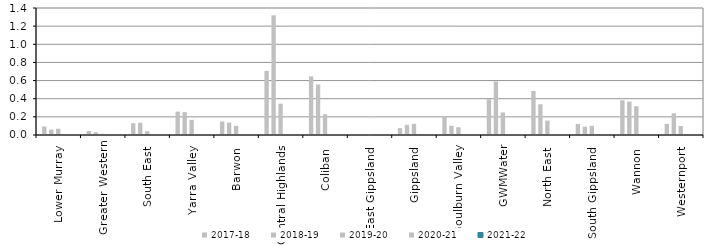
| Category | 2017-18 | 2018-19 | 2019-20 | 2020-21 | 2021-22 |
|---|---|---|---|---|---|
| Lower Murray  | 0.094 | 0.06 | 0.069 | 0 | 0 |
| Greater Western | 0.044 | 0.03 | 0.013 | 0 | 0 |
| South East  | 0.13 | 0.135 | 0.041 | 0 | 0 |
| Yarra Valley  | 0.258 | 0.252 | 0.167 | 0 | 0 |
| Barwon  | 0.149 | 0.137 | 0.101 | 0 | 0 |
| Central Highlands  | 0.707 | 1.319 | 0.345 | 0 | 0 |
| Coliban  | 0.647 | 0.557 | 0.229 | 0 | 0 |
| East Gippsland  | 0 | 0 | 0.005 | 0 | 0 |
| Gippsland  | 0.075 | 0.113 | 0.123 | 0 | 0 |
| Goulburn Valley  | 0.211 | 0.102 | 0.085 | 0 | 0 |
| GWMWater | 0.394 | 0.591 | 0.248 | 0 | 0 |
| North East  | 0.486 | 0.338 | 0.158 | 0 | 0 |
| South Gippsland  | 0.122 | 0.091 | 0.101 | 0 | 0 |
| Wannon  | 0.382 | 0.369 | 0.317 | 0 | 0 |
| Westernport  | 0.123 | 0.239 | 0.099 | 0 | 0 |